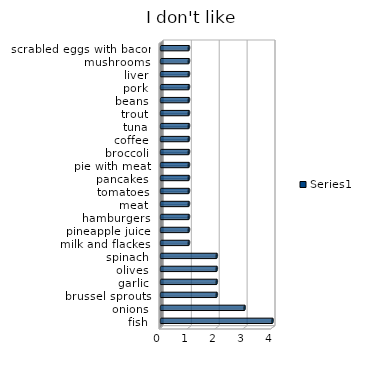
| Category | Series 0 |
|---|---|
| fish | 4 |
| onions | 3 |
| brussel sprouts | 2 |
| garlic | 2 |
| olives | 2 |
| spinach | 2 |
| milk and flackes | 1 |
| pineapple juice | 1 |
| hamburgers | 1 |
| meat | 1 |
| tomatoes | 1 |
| pancakes | 1 |
| pie with meat | 1 |
| broccoli | 1 |
| coffee | 1 |
| tuna | 1 |
| trout | 1 |
| beans | 1 |
| pork | 1 |
| liver | 1 |
| mushrooms | 1 |
| scrabled eggs with bacon | 1 |